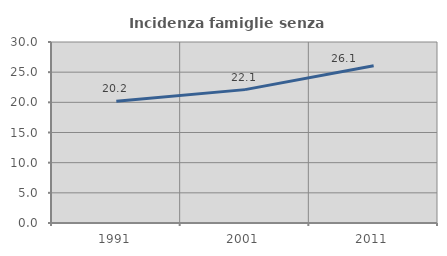
| Category | Incidenza famiglie senza nuclei |
|---|---|
| 1991.0 | 20.176 |
| 2001.0 | 22.106 |
| 2011.0 | 26.073 |